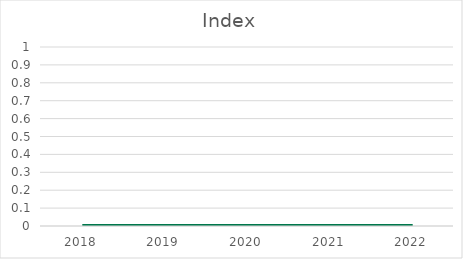
| Category | Index |
|---|---|
| 2018.0 | 0 |
| 2019.0 | 0 |
| 2020.0 | 0 |
| 2021.0 | 0 |
| 2022.0 | 0 |